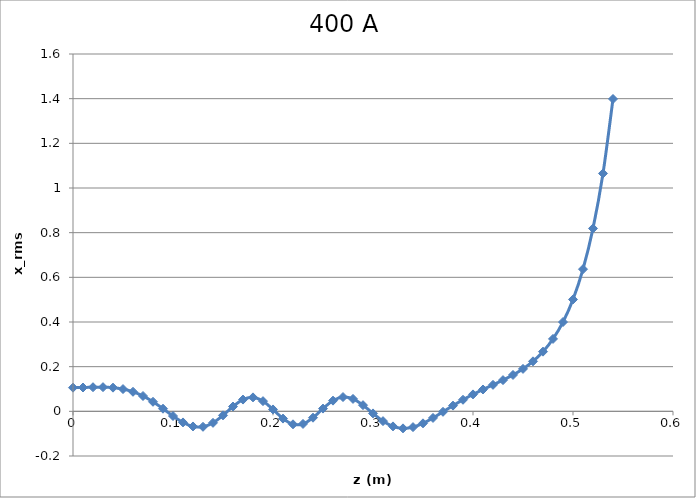
| Category | Series 0 |
|---|---|
| 0.0 | 0.106 |
| 0.01 | 0.107 |
| 0.02 | 0.108 |
| 0.03 | 0.108 |
| 0.04 | 0.106 |
| 0.05 | 0.1 |
| 0.06 | 0.088 |
| 0.07 | 0.069 |
| 0.08 | 0.043 |
| 0.09 | 0.012 |
| 0.1 | -0.021 |
| 0.11 | -0.05 |
| 0.12 | -0.068 |
| 0.13 | -0.069 |
| 0.14 | -0.051 |
| 0.15 | -0.018 |
| 0.16 | 0.021 |
| 0.17 | 0.053 |
| 0.18 | 0.062 |
| 0.19 | 0.046 |
| 0.2 | 0.008 |
| 0.21 | -0.032 |
| 0.22 | -0.058 |
| 0.23 | -0.056 |
| 0.24 | -0.029 |
| 0.25 | 0.012 |
| 0.26 | 0.048 |
| 0.27 | 0.064 |
| 0.28 | 0.056 |
| 0.29 | 0.028 |
| 0.3 | -0.009 |
| 0.31 | -0.044 |
| 0.32 | -0.067 |
| 0.33 | -0.076 |
| 0.34 | -0.071 |
| 0.35 | -0.054 |
| 0.36 | -0.03 |
| 0.37 | -0.002 |
| 0.38 | 0.026 |
| 0.39 | 0.052 |
| 0.4 | 0.076 |
| 0.41 | 0.098 |
| 0.42 | 0.119 |
| 0.43 | 0.14 |
| 0.44 | 0.163 |
| 0.45 | 0.19 |
| 0.46 | 0.224 |
| 0.47 | 0.267 |
| 0.48 | 0.324 |
| 0.49 | 0.4 |
| 0.5 | 0.501 |
| 0.51 | 0.636 |
| 0.52 | 0.819 |
| 0.53 | 1.065 |
| 0.54 | 1.399 |